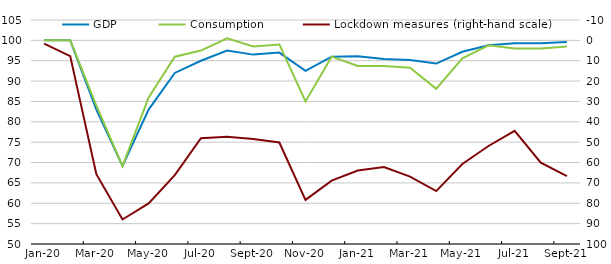
| Category | GDP | Consumption |
|---|---|---|
| 43831.0 | 100 | 100 |
| 43862.0 | 100 | 100 |
| 43891.0 | 83 | 84 |
| 43922.0 | 69.2 | 69.1 |
| 43952.0 | 83 | 86 |
| 43983.0 | 92 | 96 |
| 44013.0 | 95 | 97.5 |
| 44044.0 | 97.5 | 100.5 |
| 44075.0 | 96.5 | 98.5 |
| 44105.0 | 97 | 99 |
| 44136.0 | 92.5 | 85 |
| 44166.0 | 96 | 96 |
| 44197.0 | 96.1 | 93.7 |
| 44228.0 | 95.4 | 93.7 |
| 44256.0 | 95.2 | 93.3 |
| 44287.0 | 94.3 | 88.1 |
| 44317.0 | 97.2 | 95.6 |
| 44348.0 | 98.8 | 98.8 |
| 44378.0 | 99.3 | 98 |
| 44409.0 | 99.3 | 98 |
| 44440.0 | 99.6 | 98.5 |